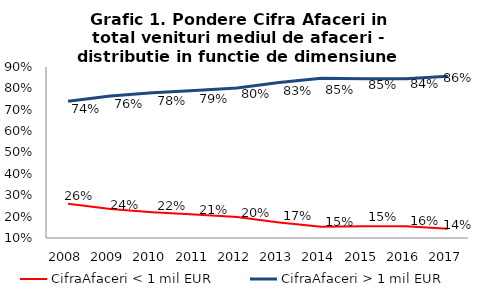
| Category | CifraAfaceri < 1 mil EUR | CifraAfaceri > 1 mil EUR |
|---|---|---|
| 2008.0 | 0.26 | 0.74 |
| 2009.0 | 0.235 | 0.765 |
| 2010.0 | 0.221 | 0.779 |
| 2011.0 | 0.21 | 0.79 |
| 2012.0 | 0.198 | 0.802 |
| 2013.0 | 0.173 | 0.827 |
| 2014.0 | 0.152 | 0.848 |
| 2015.0 | 0.155 | 0.845 |
| 2016.0 | 0.155 | 0.845 |
| 2017.0 | 0.143 | 0.857 |